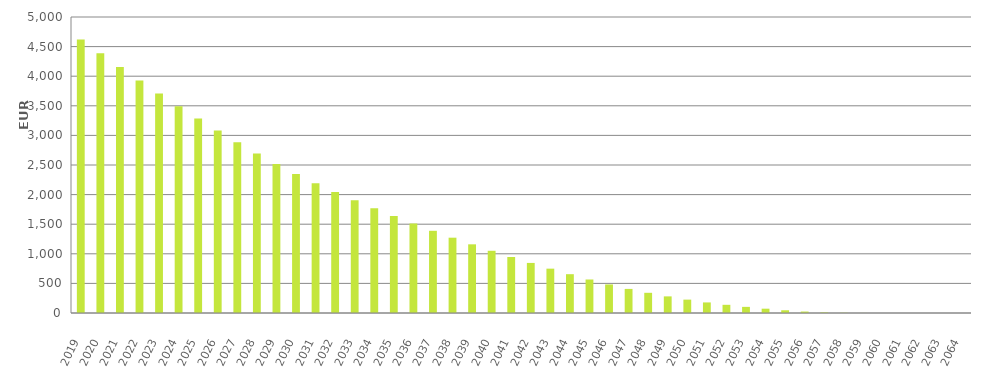
| Category | EUR Millions |
|---|---|
| 2019.0 | 4620000000 |
| 2020.0 | 4386031241.653 |
| 2021.0 | 4154678095.768 |
| 2022.0 | 3928492036.26 |
| 2023.0 | 3708226040.226 |
| 2024.0 | 3494099907.83 |
| 2025.0 | 3285388846.155 |
| 2026.0 | 3081976009.717 |
| 2027.0 | 2884128191.799 |
| 2028.0 | 2693754168.011 |
| 2029.0 | 2515216864.262 |
| 2030.0 | 2347941457.991 |
| 2031.0 | 2190745733.587 |
| 2032.0 | 2043006260.723 |
| 2033.0 | 1904739945.952 |
| 2034.0 | 1770349690.809 |
| 2035.0 | 1638164729.814 |
| 2036.0 | 1510683268.342 |
| 2037.0 | 1388465863.429 |
| 2038.0 | 1272154255.473 |
| 2039.0 | 1160064583.44 |
| 2040.0 | 1050963562.956 |
| 2041.0 | 946369644.949 |
| 2042.0 | 845863192.404 |
| 2043.0 | 749019803.484 |
| 2044.0 | 655649973.458 |
| 2045.0 | 565982233.39 |
| 2046.0 | 482192498.063 |
| 2047.0 | 406905953.072 |
| 2048.0 | 341125210.644 |
| 2049.0 | 280706878.435 |
| 2050.0 | 225966485.005 |
| 2051.0 | 178570548.774 |
| 2052.0 | 138289554.06 |
| 2053.0 | 103425692.78 |
| 2054.0 | 72865585.127 |
| 2055.0 | 46171882.993 |
| 2056.0 | 24414867.461 |
| 2057.0 | 9604696.575 |
| 2058.0 | 3762449.257 |
| 2059.0 | 1024867.196 |
| 2060.0 | 191932.269 |
| 2061.0 | 52885.035 |
| 2062.0 | 16107.904 |
| 2063.0 | 0 |
| 2064.0 | 0 |